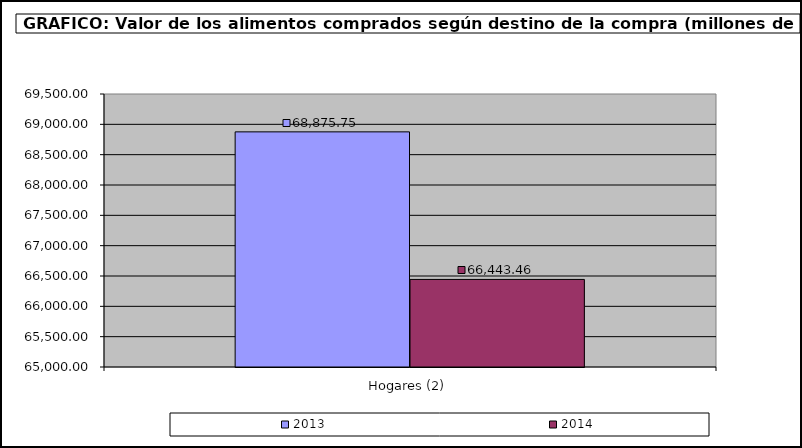
| Category | 2013 | 2014 |
|---|---|---|
| Hogares (2) | 68875.748 | 66443.456 |